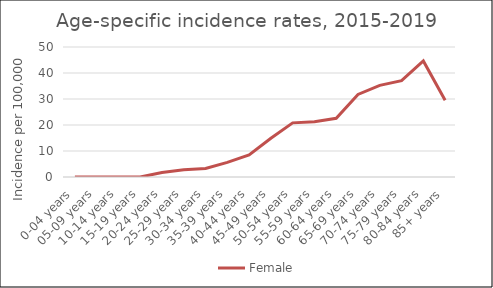
| Category | Male | Female |
|---|---|---|
| 0-04 years |  | 0 |
| 05-09 years |  | 0 |
| 10-14 years |  | 0 |
| 15-19 years |  | 0 |
| 20-24 years |  | 1.71 |
| 25-29 years |  | 2.79 |
| 30-34 years |  | 3.27 |
| 35-39 years |  | 5.64 |
| 40-44 years |  | 8.45 |
| 45-49 years |  | 14.91 |
| 50-54 years |  | 20.82 |
| 55-59 years |  | 21.21 |
| 60-64 years |  | 22.6 |
| 65-69 years |  | 31.76 |
| 70-74 years |  | 35.23 |
| 75-79 years |  | 37.07 |
| 80-84 years |  | 44.63 |
| 85+ years |  | 29.55 |